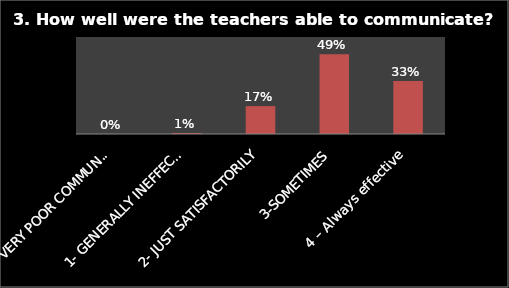
| Category | Series 0 |
|---|---|
| 0- VERY POOR COMMUNICATION | 0 |
| 1- GENERALLY INEFFECTIVE | 0.006 |
| 2- JUST SATISFACTORILY | 0.172 |
| 3-SOMETIMES | 0.493 |
| 4 – Always effective | 0.328 |